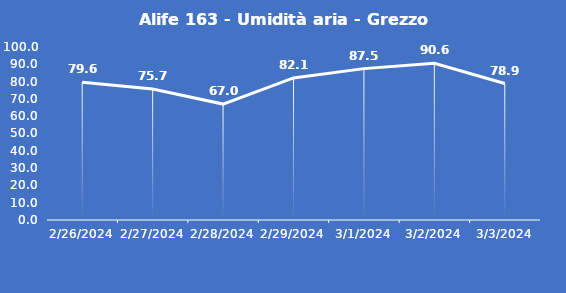
| Category | Alife 163 - Umidità aria - Grezzo (%) |
|---|---|
| 2/26/24 | 79.6 |
| 2/27/24 | 75.7 |
| 2/28/24 | 67 |
| 2/29/24 | 82.1 |
| 3/1/24 | 87.5 |
| 3/2/24 | 90.6 |
| 3/3/24 | 78.9 |